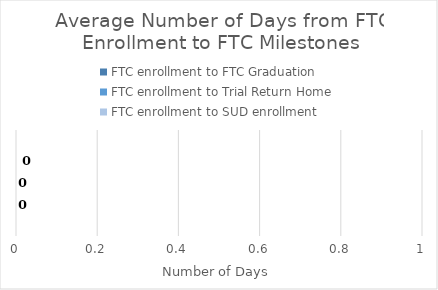
| Category | FTC enrollment to FTC Graduation | FTC enrollment to Trial Return Home | FTC enrollment to SUD enrollment |
|---|---|---|---|
| 0 | 0 | 0 | 0 |